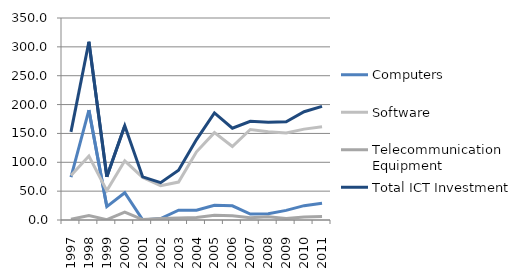
| Category | Computers | Software | Telecommunication Equipment | Total ICT Investment |
|---|---|---|---|---|
| 1997.0 | 74.357 | 77.182 | 1.192 | 152.731 |
| 1998.0 | 190.375 | 110.875 | 7.648 | 308.898 |
| 1999.0 | 23.272 | 50.97 | 0.704 | 74.946 |
| 2000.0 | 47.241 | 102.598 | 13.495 | 163.334 |
| 2001.0 | 0.181 | 73.8 | 0.724 | 74.705 |
| 2002.0 | 2.578 | 59.389 | 2.782 | 64.749 |
| 2003.0 | 16.91 | 65.732 | 3.546 | 86.188 |
| 2004.0 | 17.032 | 118.119 | 4.215 | 139.366 |
| 2005.0 | 25.662 | 151.395 | 8.376 | 185.433 |
| 2006.0 | 24.498 | 127.323 | 7.252 | 159.073 |
| 2007.0 | 10.367 | 156.813 | 3.805 | 170.985 |
| 2008.0 | 11.021 | 153.044 | 5.474 | 169.539 |
| 2009.0 | 16.669 | 150.744 | 2.818 | 170.231 |
| 2010.0 | 24.879 | 157.481 | 5.232 | 187.592 |
| 2011.0 | 29.202 | 161.725 | 6.053 | 196.98 |